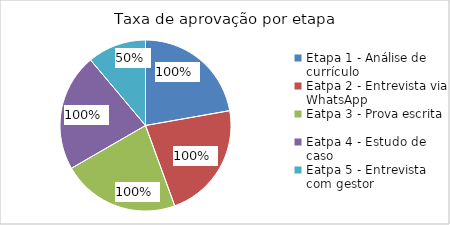
| Category | taxa de aprovações |
|---|---|
| Etapa 1 - Análise de currículo | 1 |
| Eatpa 2 - Entrevista via WhatsApp | 1 |
| Eatpa 3 - Prova escrita | 1 |
| Eatpa 4 - Estudo de caso | 1 |
| Eatpa 5 - Entrevista com gestor | 0.5 |